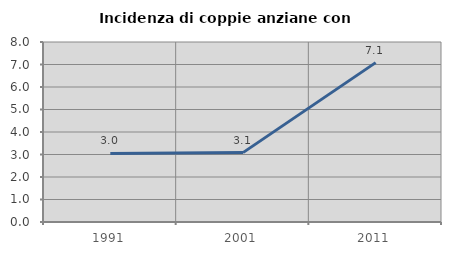
| Category | Incidenza di coppie anziane con figli |
|---|---|
| 1991.0 | 3.046 |
| 2001.0 | 3.084 |
| 2011.0 | 7.083 |